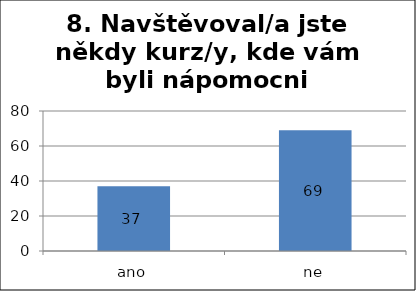
| Category | Series 0 |
|---|---|
| ano | 37 |
| ne | 69 |